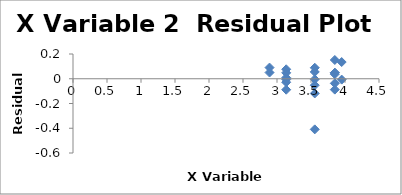
| Category | Series 0 |
|---|---|
| 2.890371757896164 | 0.09 |
| 3.555348061489414 | 0.089 |
| 3.951243718581428 | 0.135 |
| 3.951243718581428 | -0.007 |
| 2.890371757896164 | 0.05 |
| 3.555348061489414 | -0.004 |
| 3.555348061489414 | -0.119 |
| 3.555348061489414 | -0.409 |
| 3.13549421592915 | -0.006 |
| 3.13549421592915 | -0.089 |
| 3.850147601710058 | 0.049 |
| 3.850147601710058 | -0.037 |
| 3.850147601710058 | -0.088 |
| 3.13549421592915 | -0.028 |
| 3.13549421592915 | 0.048 |
| 3.13549421592915 | 0.076 |
| 3.13549421592915 | 0.009 |
| 3.850147601710058 | 0.048 |
| 3.850147601710058 | 0.037 |
| 3.850147601710058 | 0.152 |
| 3.555348061489414 | 0.055 |
| 3.555348061489414 | -0.052 |